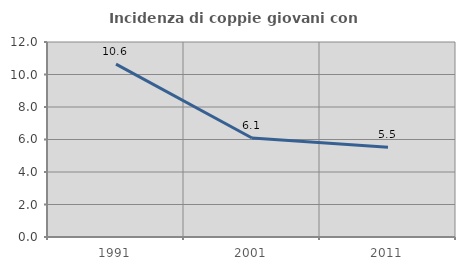
| Category | Incidenza di coppie giovani con figli |
|---|---|
| 1991.0 | 10.638 |
| 2001.0 | 6.095 |
| 2011.0 | 5.53 |